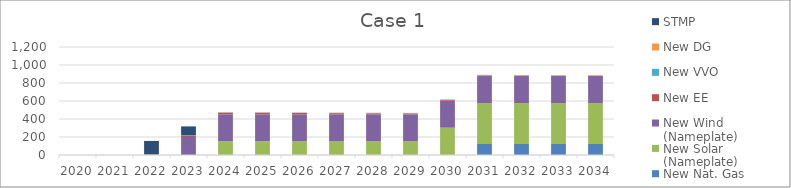
| Category | New Nat. Gas | New Solar (Nameplate) | New Wind (Nameplate) | New EE | New VVO | New DG | STMP |
|---|---|---|---|---|---|---|---|
| 2020.0 | 0 | 0 | 0 | 0 | 0 | 0 | 0 |
| 2021.0 | 0 | 0 | 0 | 0 | 0 | 0 | 0 |
| 2022.0 | 0 | 0 | 0 | 6.444 | 0 | 0 | 150 |
| 2023.0 | 0 | 0 | 200 | 12.438 | 4.27 | 1.022 | 100 |
| 2024.0 | 0 | 151.796 | 300 | 18.267 | 4.27 | 1.533 | 0 |
| 2025.0 | 0 | 151.796 | 300 | 17.135 | 4.27 | 1.533 | 0 |
| 2026.0 | 0 | 151.796 | 300 | 15.082 | 4.27 | 1.533 | 0 |
| 2027.0 | 0 | 151.796 | 300 | 12.978 | 4.27 | 2.044 | 0 |
| 2028.0 | 0 | 151.796 | 300 | 11.392 | 4.27 | 2.044 | 0 |
| 2029.0 | 0 | 151.796 | 300 | 9.644 | 4.27 | 2.555 | 0 |
| 2030.0 | 0 | 303.593 | 300 | 7.771 | 4.27 | 3.066 | 0 |
| 2031.0 | 122 | 455.389 | 300 | 5.77 | 4.27 | 3.577 | 0 |
| 2032.0 | 122 | 455.389 | 300 | 3.983 | 4.27 | 3.577 | 0 |
| 2033.0 | 122 | 455.389 | 300 | 2.584 | 4.27 | 4.088 | 0 |
| 2034.0 | 122 | 455.389 | 300 | 1.509 | 4.27 | 4.599 | 0 |